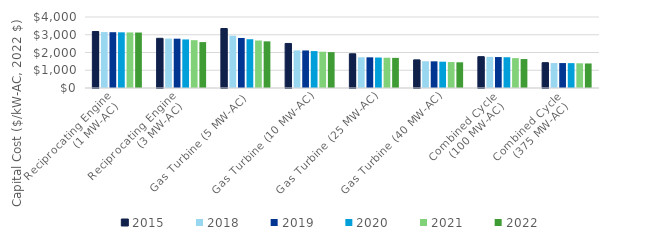
| Category | 2015 | 2018 | 2019 | 2020 | 2021 | 2022 |
|---|---|---|---|---|---|---|
| Reciprocating Engine
(1 MW-AC) | 3182.002 | 3151.115 | 3143.6 | 3136.732 | 3129.864 | 3125.286 |
| Reciprocating Engine
(3 MW-AC) | 2799.8 | 2783.795 | 2778.2 | 2736.069 | 2693.939 | 2585.852 |
| Gas Turbine (5 MW-AC) | 3350.625 | 2947.168 | 2818.8 | 2747.414 | 2676.028 | 2628.438 |
| Gas Turbine (10 MW-AC) | 2509.52 | 2119.407 | 2115.198 | 2079.646 | 2044.095 | 2020.394 |
| Gas Turbine (25 MW-AC) | 1927.86 | 1731.65 | 1728.055 | 1716.344 | 1704.633 | 1696.826 |
| Gas Turbine (40 MW-AC) | 1584.96 | 1505.283 | 1502.165 | 1481.778 | 1461.391 | 1447.8 |
| Combined Cycle
(100 MW-AC) | 1765.12 | 1753.545 | 1743.579 | 1732.64 | 1682.371 | 1632.102 |
| Combined Cycle
(375 MW-AC) | 1426.88 | 1406.197 | 1404.612 | 1400.778 | 1391.665 | 1382.553 |